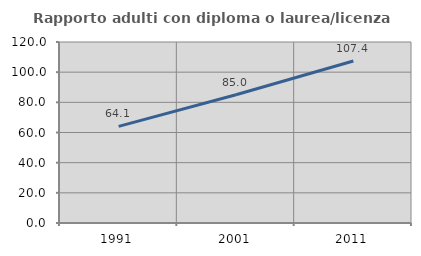
| Category | Rapporto adulti con diploma o laurea/licenza media  |
|---|---|
| 1991.0 | 64.072 |
| 2001.0 | 84.995 |
| 2011.0 | 107.37 |